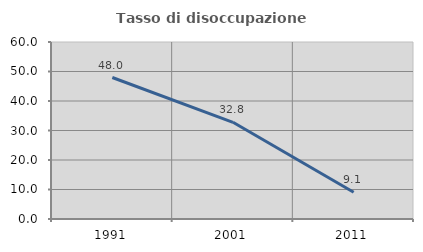
| Category | Tasso di disoccupazione giovanile  |
|---|---|
| 1991.0 | 47.956 |
| 2001.0 | 32.773 |
| 2011.0 | 9.091 |